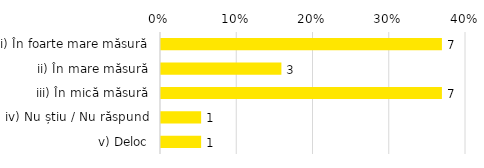
| Category | Total |
|---|---|
| i) În foarte mare măsură | 0.368 |
| ii) În mare măsură | 0.158 |
| iii) În mică măsură | 0.368 |
| iv) Nu știu / Nu răspund | 0.053 |
| v) Deloc | 0.053 |